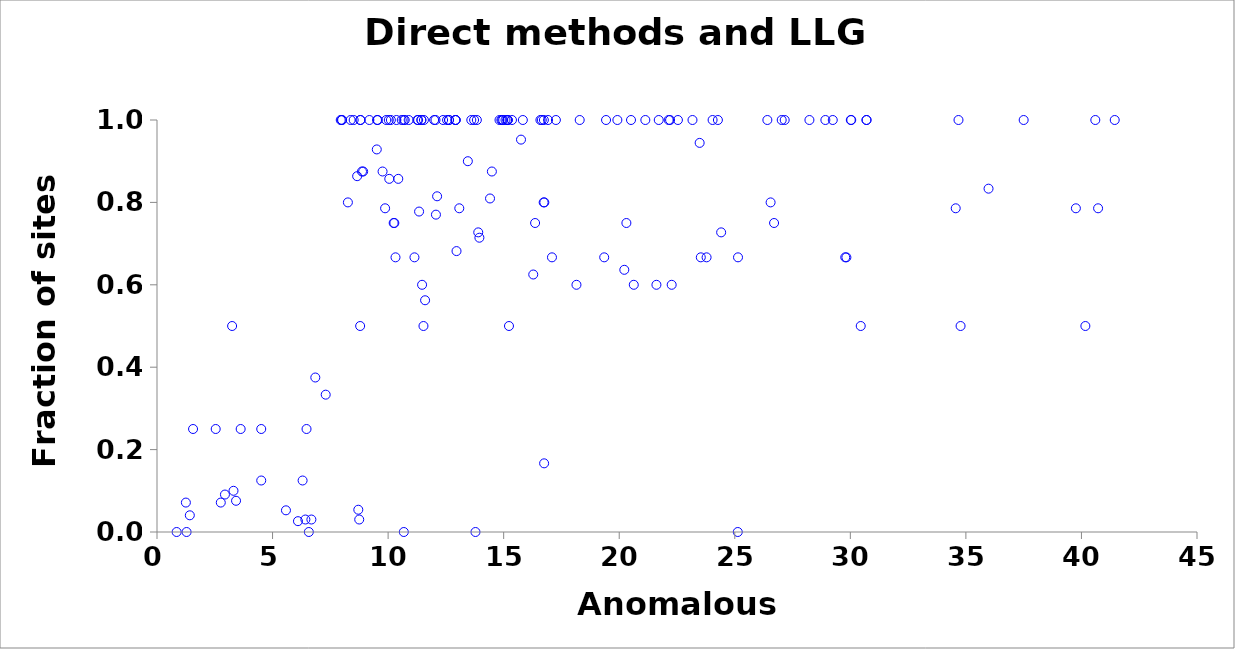
| Category | LLGC+Direct Methods |
|---|---|
| 14.94 | 1 |
| 15.18 | 1 |
| 22.14 | 1 |
| 25.13 | 0 |
| 12.05 | 1 |
| 12.64 | 1 |
| 41.44 | 1 |
| 7.3 | 0.333 |
| 19.35 | 0.667 |
| 23.78 | 0.667 |
| 29.78 | 0.667 |
| 8.8 | 1 |
| 9.55 | 1 |
| 9.92 | 1 |
| 10.67 | 1 |
| 11.44 | 1 |
| 13.84 | 1 |
| 15.18 | 1 |
| 16.74 | 1 |
| 19.43 | 1 |
| 23.53 | 0.667 |
| 25.14 | 0.667 |
| 29.83 | 0.667 |
| 1.28 | 0 |
| 1.56 | 0.25 |
| 2.54 | 0.25 |
| 3.62 | 0.25 |
| 6.47 | 0.25 |
| 30.45 | 0.5 |
| 34.77 | 0.5 |
| 40.17 | 0.5 |
| 20.31 | 0.75 |
| 26.7 | 0.75 |
| 8.51 | 1 |
| 11.27 | 1 |
| 11.55 | 1 |
| 14.98 | 1 |
| 15.08 | 1 |
| 16.59 | 1 |
| 16.92 | 1 |
| 18.29 | 1 |
| 19.92 | 1 |
| 20.51 | 1 |
| 21.13 | 1 |
| 22.2 | 1 |
| 22.54 | 1 |
| 27.16 | 1 |
| 28.23 | 1 |
| 30.04 | 1 |
| 8.26 | 0.8 |
| 16.73 | 0.8 |
| 20.63 | 0.6 |
| 8.38 | 1 |
| 10.36 | 1 |
| 11.47 | 0.6 |
| 12.63 | 1 |
| 14.82 | 1 |
| 14.9 | 1 |
| 15.36 | 1 |
| 17.26 | 1 |
| 21.61 | 0.6 |
| 21.71 | 1 |
| 28.92 | 1 |
| 29.24 | 1 |
| 16.75 | 0.167 |
| 23.17 | 1 |
| 24.04 | 1 |
| 24.27 | 1 |
| 26.41 | 1 |
| 27.03 | 1 |
| 30.02 | 1 |
| 30.7 | 1 |
| 30.7 | 1 |
| 34.68 | 1 |
| 37.5 | 1 |
| 10.05 | 0.857 |
| 8.8 | 1 |
| 9.19 | 1 |
| 10.03 | 1 |
| 10.12 | 1 |
| 12.92 | 1 |
| 0.85 | 0 |
| 6.57 | 0 |
| 4.51 | 0.125 |
| 6.3 | 0.125 |
| 4.51 | 0.25 |
| 6.85 | 0.375 |
| 40.6 | 1 |
| 3.25 | 0.5 |
| 8.87 | 0.875 |
| 14.49 | 0.875 |
| 7.95 | 1 |
| 7.99 | 1 |
| 8.01 | 1 |
| 9.52 | 1 |
| 10.72 | 1 |
| 11.44 | 1 |
| 11.53 | 0.5 |
| 11.99 | 1 |
| 12.38 | 1 |
| 12.55 | 1 |
| 12.92 | 1 |
| 13.72 | 1 |
| 15.15 | 1 |
| 16.28 | 0.625 |
| 16.65 | 1 |
| 10.32 | 0.667 |
| 11.14 | 0.667 |
| 17.09 | 0.667 |
| 3.31 | 0.1 |
| 8.79 | 0.5 |
| 16.76 | 0.8 |
| 18.15 | 0.6 |
| 13.45 | 0.9 |
| 22.27 | 0.6 |
| 26.55 | 0.8 |
| 15.23 | 0.5 |
| 10.68 | 0 |
| 2.94 | 0.091 |
| 13.9 | 0.727 |
| 20.22 | 0.636 |
| 24.41 | 0.727 |
| 10.24 | 0.75 |
| 10.27 | 0.75 |
| 10.89 | 1 |
| 12.92 | 1 |
| 13.6 | 1 |
| 15.83 | 1 |
| 16.36 | 0.75 |
| 1.25 | 0.071 |
| 2.76 | 0.071 |
| 9.87 | 0.786 |
| 10.44 | 0.857 |
| 9.51 | 0.929 |
| 11.3 | 1 |
| 13.08 | 0.786 |
| 13.95 | 0.714 |
| 34.56 | 0.786 |
| 39.76 | 0.786 |
| 40.72 | 0.786 |
| 11.6 | 0.562 |
| 8.92 | 0.875 |
| 9.76 | 0.875 |
| 10.59 | 1 |
| 23.48 | 0.944 |
| 35.98 | 0.833 |
| 14.41 | 0.81 |
| 15.75 | 0.952 |
| 8.66 | 0.864 |
| 12.96 | 0.682 |
| 13.78 | 0 |
| 11.34 | 0.778 |
| 12.12 | 0.815 |
| 6.42 | 0.03 |
| 6.68 | 0.03 |
| 8.75 | 0.03 |
| 6.1 | 0.026 |
| 5.58 | 0.053 |
| 3.42 | 0.076 |
| 8.71 | 0.054 |
| 1.42 | 0.041 |
| 12.07 | 0.77 |